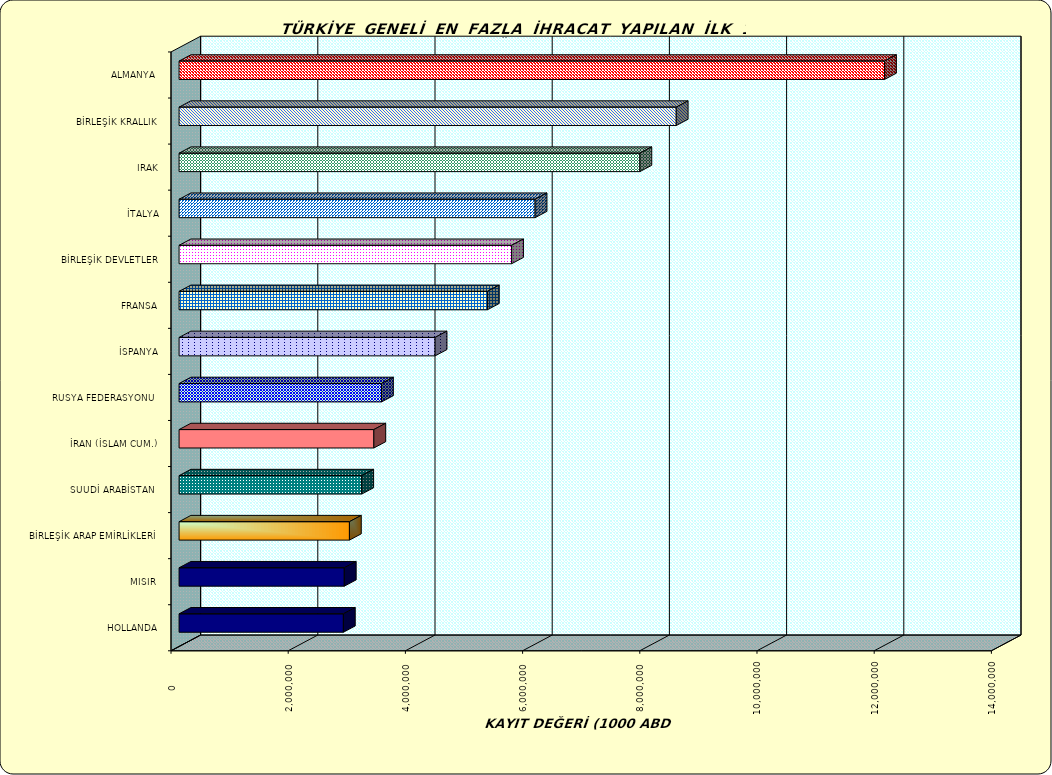
| Category | Series 0 |
|---|---|
| ALMANYA  | 12038762.776 |
| BİRLEŞİK KRALLIK | 8484366.84 |
| IRAK | 7863948.525 |
| İTALYA | 6075579.222 |
| BİRLEŞİK DEVLETLER | 5674765.69 |
| FRANSA | 5261264.05 |
| İSPANYA | 4369332.205 |
| RUSYA FEDERASYONU  | 3454811.416 |
| İRAN (İSLAM CUM.) | 3323915.791 |
| SUUDİ ARABİSTAN  | 3117123.124 |
| BİRLEŞİK ARAP EMİRLİKLERİ | 2906930.065 |
| MISIR  | 2819452.167 |
| HOLLANDA | 2803809.949 |